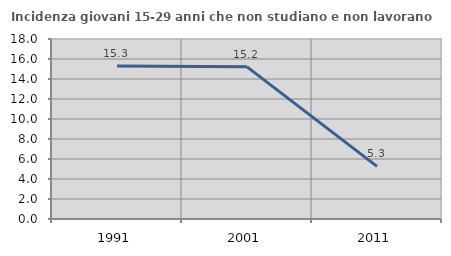
| Category | Incidenza giovani 15-29 anni che non studiano e non lavorano  |
|---|---|
| 1991.0 | 15.294 |
| 2001.0 | 15.217 |
| 2011.0 | 5.263 |